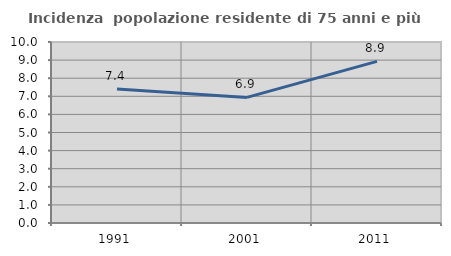
| Category | Incidenza  popolazione residente di 75 anni e più |
|---|---|
| 1991.0 | 7.401 |
| 2001.0 | 6.94 |
| 2011.0 | 8.931 |